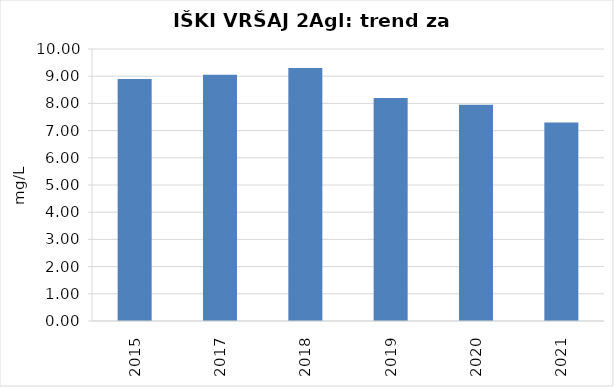
| Category | Vsota |
|---|---|
| 2015 | 8.9 |
| 2017 | 9.05 |
| 2018 | 9.3 |
| 2019 | 8.2 |
| 2020 | 7.95 |
| 2021 | 7.3 |